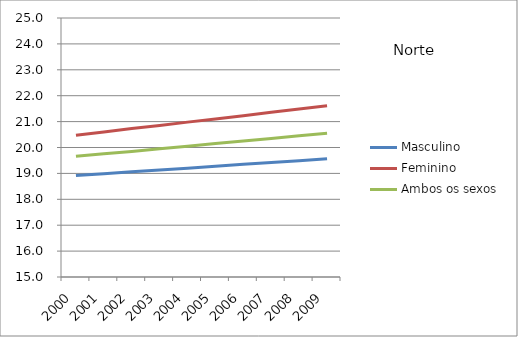
| Category | Masculino | Feminino | Ambos os sexos |
|---|---|---|---|
| 2000.0 | 18.92 | 20.47 | 19.66 |
| 2001.0 | 18.99 | 20.6 | 19.76 |
| 2002.0 | 19.06 | 20.73 | 19.85 |
| 2003.0 | 19.13 | 20.85 | 19.95 |
| 2004.0 | 19.2 | 20.98 | 20.05 |
| 2005.0 | 19.28 | 21.1 | 20.15 |
| 2006.0 | 19.35 | 21.23 | 20.25 |
| 2007.0 | 19.42 | 21.36 | 20.35 |
| 2008.0 | 19.49 | 21.49 | 20.45 |
| 2009.0 | 19.57 | 21.61 | 20.55 |